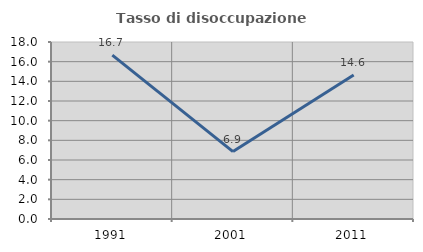
| Category | Tasso di disoccupazione giovanile  |
|---|---|
| 1991.0 | 16.667 |
| 2001.0 | 6.857 |
| 2011.0 | 14.634 |